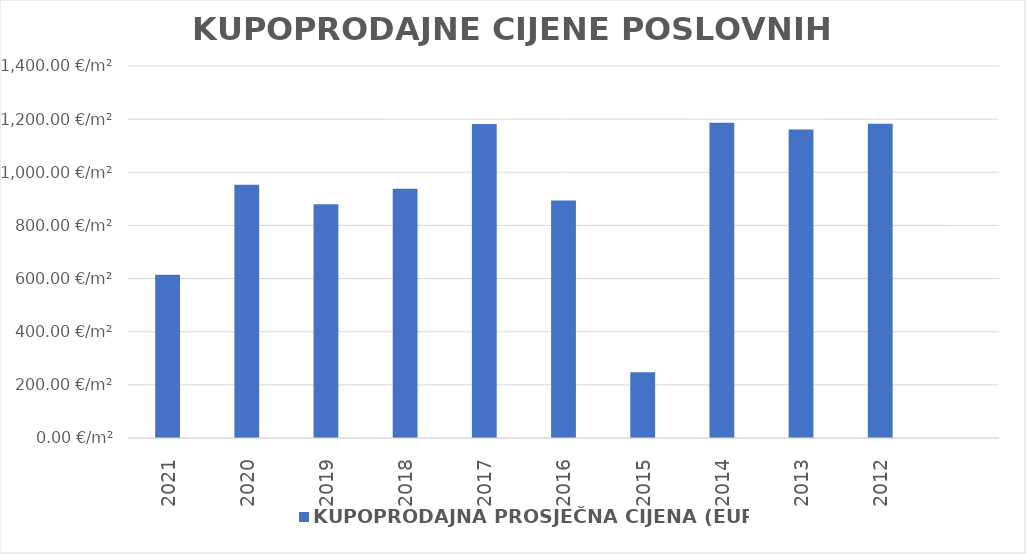
| Category | KUPOPRODAJNA PROSJEČNA CIJENA (EUR/m²) |
|---|---|
| 2021 | 1901-09-04 23:02:35 |
| 2020 | 1902-08-10 04:23:58 |
| 2019 | 1902-05-28 10:06:00 |
| 2018 | 1902-07-26 10:56:25 |
| 2017 | 1903-03-26 11:09:27 |
| 2016 | 1902-06-12 01:21:03 |
| 2015 | 1900-09-03 20:16:31 |
| 2014 | 1903-03-31 07:42:14 |
| 2013 | 1903-03-05 22:37:08 |
| 2012 | 1903-03-27 15:47:24 |